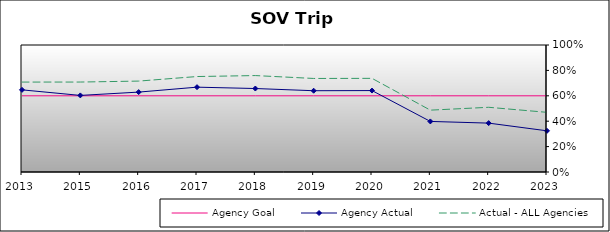
| Category | Agency Goal | Agency Actual | Actual - ALL Agencies |
|---|---|---|---|
| 2013.0 | 0.6 | 0.647 | 0.708 |
| 2015.0 | 0.6 | 0.603 | 0.708 |
| 2016.0 | 0.6 | 0.629 | 0.716 |
| 2017.0 | 0.6 | 0.668 | 0.752 |
| 2018.0 | 0.6 | 0.657 | 0.759 |
| 2019.0 | 0.6 | 0.64 | 0.736 |
| 2020.0 | 0.6 | 0.641 | 0.737 |
| 2021.0 | 0.6 | 0.398 | 0.487 |
| 2022.0 | 0.6 | 0.385 | 0.509 |
| 2023.0 | 0.6 | 0.324 | 0.47 |